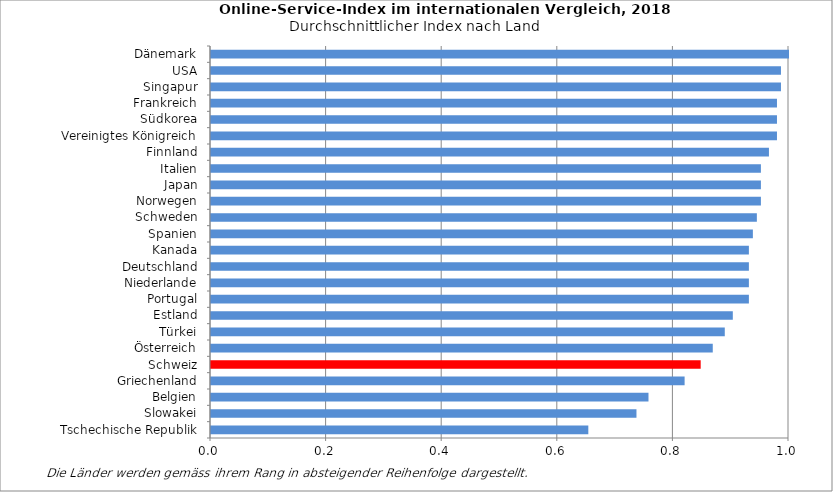
| Category | durchschnittlicher Index |
|---|---|
| Tschechische Republik | 0.653 |
| Slowakei | 0.736 |
| Belgien | 0.757 |
| Griechenland | 0.819 |
| Schweiz | 0.847 |
| Österreich | 0.868 |
| Türkei | 0.889 |
| Estland | 0.903 |
| Portugal | 0.931 |
| Niederlande | 0.931 |
| Deutschland | 0.931 |
| Kanada | 0.931 |
| Spanien | 0.938 |
| Schweden | 0.944 |
| Norwegen | 0.951 |
| Japan | 0.951 |
| Italien | 0.951 |
| Finnland | 0.965 |
| Vereinigtes Königreich | 0.979 |
| Südkorea | 0.979 |
| Frankreich | 0.979 |
| Singapur | 0.986 |
| USA | 0.986 |
| Dänemark | 1 |